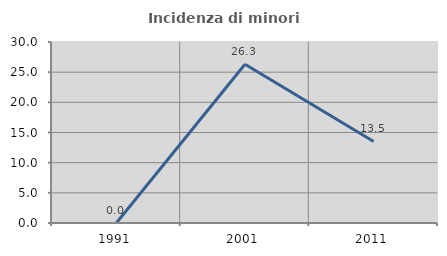
| Category | Incidenza di minori stranieri |
|---|---|
| 1991.0 | 0 |
| 2001.0 | 26.316 |
| 2011.0 | 13.514 |